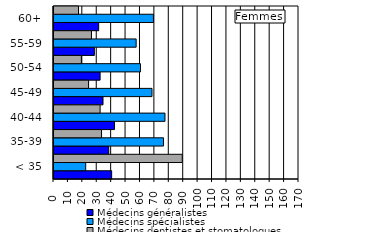
| Category | Médecins généralistes | Médecins spécialistes | Médecins dentistes et stomatologues |
|---|---|---|---|
| < 35 | 40 | 22 | 89 |
| 35-39 | 38 | 76 | 33 |
| 40-44 | 42 | 77 | 32 |
| 45-49 | 34 | 68 | 24 |
| 50-54 | 32 | 60 | 19 |
| 55-59 | 28 | 57 | 26 |
| 60+ | 31 | 69 | 17 |